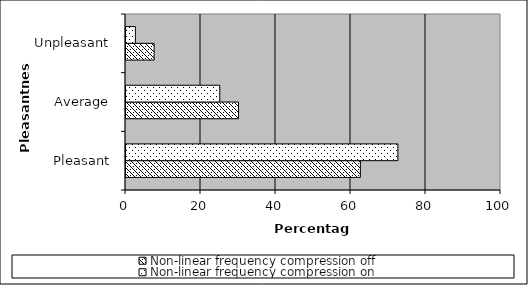
| Category | Non-linear frequency compression off | Non-linear frequency compression on |
|---|---|---|
| Pleasant | 62.5 | 72.5 |
| Average | 30 | 25 |
| Unpleasant | 7.5 | 2.5 |